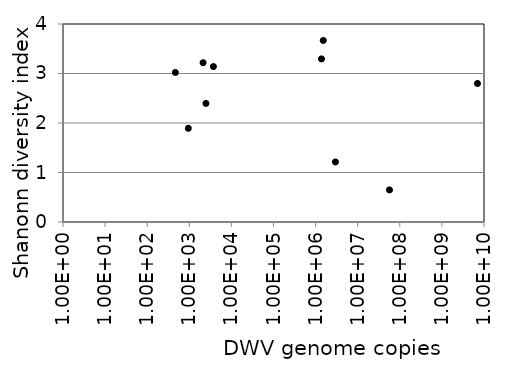
| Category | SI |
|---|---|
| 466.9450109852045 | 3.021 |
| 948.092354148805 | 1.893 |
| 2124.365218762831 | 3.218 |
| 2486.99424993627 | 2.396 |
| 3742.943492157196 | 3.14 |
| 1380203.13934939 | 3.295 |
| 1520244.15099452 | 3.668 |
| 2962847.01226412 | 1.214 |
| 56862925.885421 | 0.648 |
| 7005856507.0034 | 2.798 |